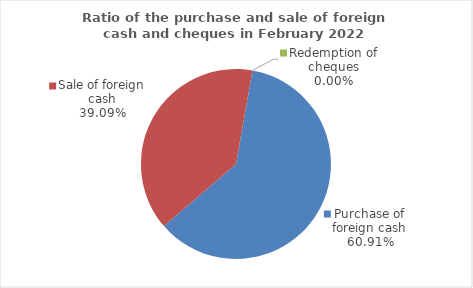
| Category | Series 0 |
|---|---|
| Purchase of foreign cash | 60.911 |
| Sale of foreign cash | 39.089 |
| Redemption of cheques | 0 |